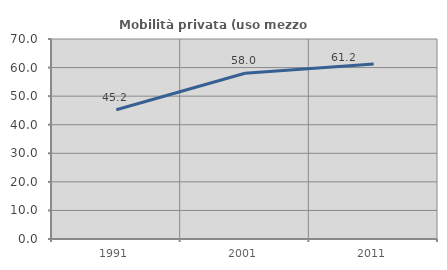
| Category | Mobilità privata (uso mezzo privato) |
|---|---|
| 1991.0 | 45.243 |
| 2001.0 | 57.993 |
| 2011.0 | 61.245 |